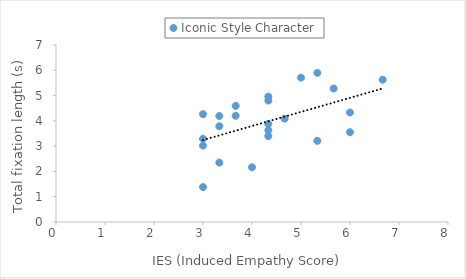
| Category | Iconic Style Character |
|---|---|
| 4.333333333333333 | 3.876 |
| 3.3333333333333335 | 4.191 |
| 5.333333333333333 | 3.209 |
| 6.0 | 4.331 |
| 4.333333333333333 | 3.398 |
| 6.0 | 3.549 |
| 5.333333333333333 | 5.897 |
| 4.0 | 2.165 |
| 5.666666666666667 | 5.278 |
| 6.666666666666667 | 5.628 |
| 4.333333333333333 | 4.802 |
| 5.0 | 5.709 |
| 3.0 | 3.021 |
| 4.333333333333333 | 4.959 |
| 4.333333333333333 | 3.624 |
| 3.3333333333333335 | 2.349 |
| 3.0 | 3.292 |
| 3.6666666666666665 | 4.593 |
| 3.3333333333333335 | 3.787 |
| 3.0 | 1.382 |
| 3.6666666666666665 | 4.201 |
| 3.0 | 4.263 |
| 4.666666666666667 | 4.088 |